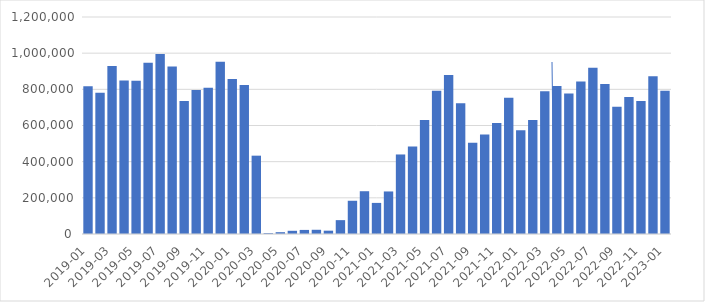
| Category | Series 0 |
|---|---|
| 2019-01 | 817600 |
| 2019-02 | 780827 |
| 2019-03 | 928849 |
| 2019-04 | 849398 |
| 2019-05 | 847396 |
| 2019-06 | 947112 |
| 2019-07 | 995210 |
| 2019-08 | 926417 |
| 2019-09 | 736155 |
| 2019-10 | 796191 |
| 2019-11 | 809076 |
| 2019-12 | 952441 |
| 2020-01 | 857066 |
| 2020-02 | 823910 |
| 2020-03 | 433167 |
| 2020-04 | 4985 |
| 2020-05 | 10013 |
| 2020-06 | 17733 |
| 2020-07 | 22574 |
| 2020-08 | 23356 |
| 2020-09 | 18409 |
| 2020-10 | 76691 |
| 2020-11 | 183779 |
| 2020-12 | 236575 |
| 2021-01 | 171980 |
| 2021-02 | 235271 |
| 2021-03 | 439796 |
| 2021-04 | 484547 |
| 2021-05 | 629847 |
| 2021-06 | 791520 |
| 2021-07 | 879554 |
| 2021-08 | 723017 |
| 2021-09 | 504586 |
| 2021-10 | 550785 |
| 2021-11 | 614018 |
| 2021-12 | 752840 |
| 2022-01 | 574183 |
| 2022-02 | 630647 |
| 2022-03 | 788931 |
| 2022-04 | 818268 |
| 2022-05 | 776375 |
| 2022-06 | 842928 |
| 2022-07 | 919154 |
| 2022-08 | 829699 |
| 2022-09 | 703271 |
| 2022-10 | 757182 |
| 2022-11 | 735340 |
| 2022-12 | 871870 |
| 2023-01 | 791781 |